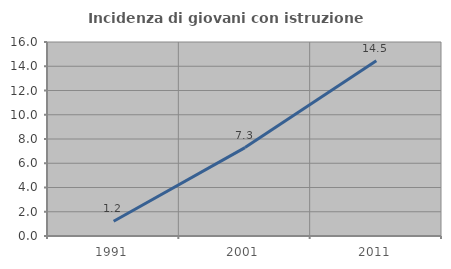
| Category | Incidenza di giovani con istruzione universitaria |
|---|---|
| 1991.0 | 1.22 |
| 2001.0 | 7.292 |
| 2011.0 | 14.458 |